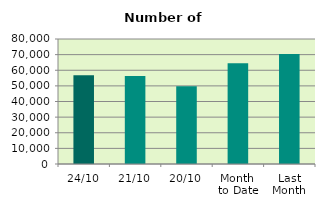
| Category | Series 0 |
|---|---|
| 24/10 | 56818 |
| 21/10 | 56310 |
| 20/10 | 49762 |
| Month 
to Date | 64550.625 |
| Last
Month | 70459.909 |